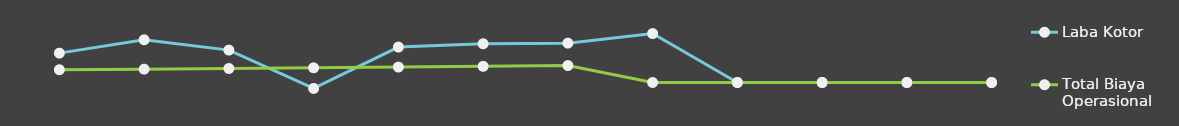
| Category | Laba Kotor | Total Biaya Operasional |
|---|---|---|
| 0 | 25000 | 10841 |
| 1 | 36348 | 11367.25 |
| 2 | 27562 | 11919.82 |
| 3 | -5059.5 | 12500.01 |
| 4 | 30153.18 | 13109.21 |
| 5 | 32964.45 | 13748.86 |
| 6 | 33502.87 | 14420.51 |
| 7 | 41646 | 0 |
| 8 | 0 | 0 |
| 9 | 0 | 0 |
| 10 | 0 | 0 |
| 11 | 0 | 0 |